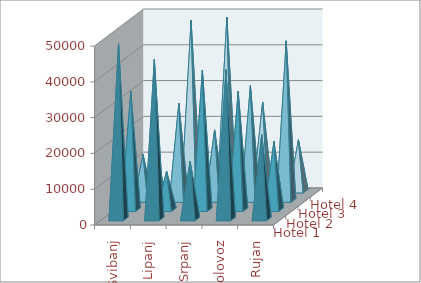
| Category | Hotel 1 | Hotel 2 | Hotel 3 | Hotel 4 |
|---|---|---|---|---|
| Svibanj | 48981 | 33097 | 12831 | 11230 |
| Lipanj | 44605 | 10762 | 27081 | 47666 |
| Srpanj | 16042 | 38986 | 19679 | 48556 |
| Kolovoz | 41667 | 33123 | 32064 | 24869 |
| Rujan | 23527 | 19066 | 44561 | 14323 |